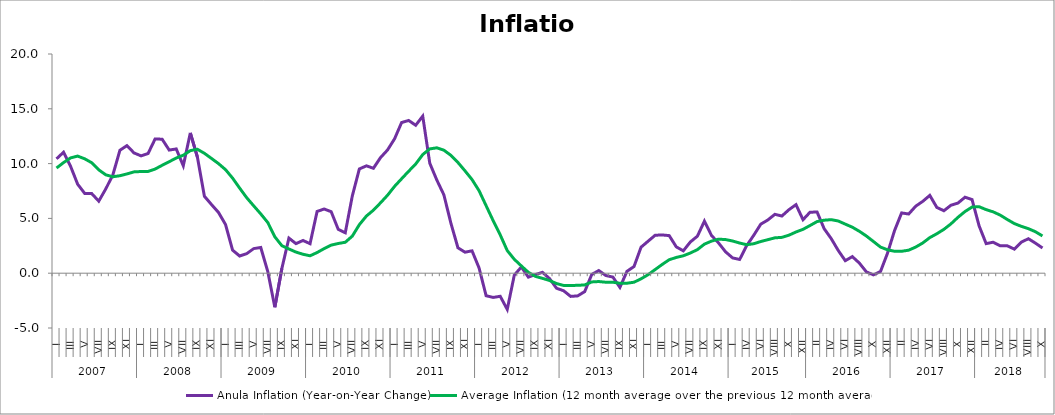
| Category | Anula Inflation (Year-on-Year Change) | Average Inflation (12 month average over the previous 12 month average) |
|---|---|---|
| 0 | 10.438 | 9.597 |
| 1 | 11.037 | 10.095 |
| 2 | 9.747 | 10.522 |
| 3 | 8.122 | 10.685 |
| 4 | 7.281 | 10.437 |
| 5 | 7.263 | 10.079 |
| 6 | 6.574 | 9.429 |
| 7 | 7.699 | 8.974 |
| 8 | 8.969 | 8.798 |
| 9 | 11.218 | 8.895 |
| 10 | 11.64 | 9.057 |
| 11 | 10.975 | 9.245 |
| 12 | 10.707 | 9.279 |
| 13 | 10.919 | 9.283 |
| 14 | 12.25 | 9.503 |
| 15 | 12.224 | 9.846 |
| 16 | 11.235 | 10.174 |
| 17 | 11.337 | 10.508 |
| 18 | 9.804 | 10.764 |
| 19 | 12.799 | 11.182 |
| 20 | 10.605 | 11.308 |
| 21 | 7.02 | 10.938 |
| 22 | 6.267 | 10.471 |
| 23 | 5.548 | 9.999 |
| 24 | 4.441 | 9.447 |
| 25 | 2.094 | 8.674 |
| 26 | 1.572 | 7.765 |
| 27 | 1.785 | 6.892 |
| 28 | 2.242 | 6.143 |
| 29 | 2.347 | 5.409 |
| 30 | 0.141 | 4.621 |
| 31 | -3.106 | 3.318 |
| 32 | 0.44 | 2.508 |
| 33 | 3.203 | 2.209 |
| 34 | 2.697 | 1.927 |
| 35 | 2.986 | 1.728 |
| 36 | 2.693 | 1.589 |
| 37 | 5.633 | 1.886 |
| 38 | 5.858 | 2.242 |
| 39 | 5.612 | 2.561 |
| 40 | 4.006 | 2.709 |
| 41 | 3.689 | 2.822 |
| 42 | 7.048 | 3.383 |
| 43 | 9.512 | 4.43 |
| 44 | 9.794 | 5.213 |
| 45 | 9.576 | 5.753 |
| 46 | 10.542 | 6.417 |
| 47 | 11.241 | 7.111 |
| 48 | 12.26 | 7.923 |
| 49 | 13.747 | 8.617 |
| 50 | 13.936 | 9.3 |
| 51 | 13.499 | 9.961 |
| 52 | 14.332 | 10.824 |
| 53 | 10.034 | 11.341 |
| 54 | 8.499 | 11.44 |
| 55 | 7.154 | 11.224 |
| 56 | 4.562 | 10.754 |
| 57 | 2.318 | 10.102 |
| 58 | 1.917 | 9.34 |
| 59 | 2.041 | 8.543 |
| 60 | 0.478 | 7.527 |
| 61 | -2.055 | 6.159 |
| 62 | -2.211 | 4.793 |
| 63 | -2.105 | 3.5 |
| 64 | -3.3 | 2.066 |
| 65 | -0.18 | 1.269 |
| 66 | 0.565 | 0.665 |
| 67 | -0.359 | 0.081 |
| 68 | -0.121 | -0.289 |
| 69 | 0.078 | -0.469 |
| 70 | -0.487 | -0.664 |
| 71 | -1.373 | -0.944 |
| 72 | -1.6 | -1.117 |
| 73 | -2.117 | -1.12 |
| 74 | -2.069 | -1.106 |
| 75 | -1.678 | -1.069 |
| 76 | -0.112 | -0.796 |
| 77 | 0.241 | -0.761 |
| 78 | -0.212 | -0.824 |
| 79 | -0.353 | -0.824 |
| 80 | -1.294 | -0.921 |
| 81 | 0.173 | -0.913 |
| 82 | 0.607 | -0.823 |
| 83 | 2.372 | -0.512 |
| 84 | 2.92 | -0.135 |
| 85 | 3.461 | 0.332 |
| 86 | 3.492 | 0.798 |
| 87 | 3.429 | 1.227 |
| 88 | 2.405 | 1.439 |
| 89 | 2.042 | 1.589 |
| 90 | 2.85 | 1.842 |
| 91 | 3.377 | 2.15 |
| 92 | 4.752 | 2.653 |
| 93 | 3.441 | 2.926 |
| 94 | 2.764 | 3.106 |
| 95 | 1.952 | 3.069 |
| 96 | 1.394 | 2.938 |
| 97 | 1.254 | 2.752 |
| 98 | 2.517 | 2.599 |
| 99 | 3.459 | 2.688 |
| 100 | 4.474 | 2.891 |
| 101 | 4.855 | 3.058 |
| 102 | 5.372 | 3.225 |
| 103 | 5.217 | 3.27 |
| 104 | 5.795 | 3.469 |
| 105 | 6.254 | 3.76 |
| 106 | 4.879 | 4.004 |
| 107 | 5.571 | 4.353 |
| 108 | 5.575 | 4.713 |
| 109 | 4.061 | 4.836 |
| 110 | 3.159 | 4.886 |
| 111 | 2.073 | 4.763 |
| 112 | 1.142 | 4.478 |
| 113 | 1.513 | 4.196 |
| 114 | 0.922 | 3.822 |
| 115 | 0.116 | 3.391 |
| 116 | -0.152 | 2.891 |
| 117 | 0.154 | 2.384 |
| 118 | 1.832 | 2.135 |
| 119 | 3.9 | 2 |
| 120 | 5.5 | 2 |
| 121 | 5.4 | 2.1 |
| 122 | 6.115 | 2.385 |
| 123 | 6.556 | 2.758 |
| 124 | 7.1 | 3.247 |
| 125 | 6 | 3.6 |
| 126 | 5.7 | 4 |
| 127 | 6.2 | 4.5 |
| 128 | 6.4 | 5.1 |
| 129 | 6.931 | 5.627 |
| 130 | 6.716 | 6.035 |
| 131 | 4.321 | 6.067 |
| 132 | 2.7 | 5.8 |
| 133 | 2.827 | 5.596 |
| 134 | 2.5 | 5.3 |
| 135 | 2.5 | 4.9 |
| 136 | 2.199 | 4.531 |
| 137 | 2.838 | 4.275 |
| 138 | 3.144 | 4.063 |
| 139 | 2.744 | 3.785 |
| 140 | 2.3 | 3.4 |